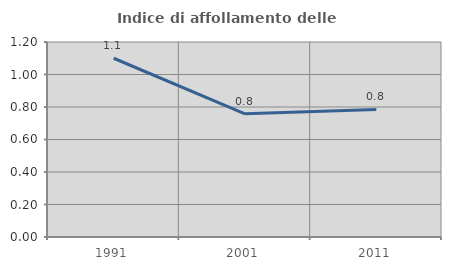
| Category | Indice di affollamento delle abitazioni  |
|---|---|
| 1991.0 | 1.1 |
| 2001.0 | 0.758 |
| 2011.0 | 0.785 |